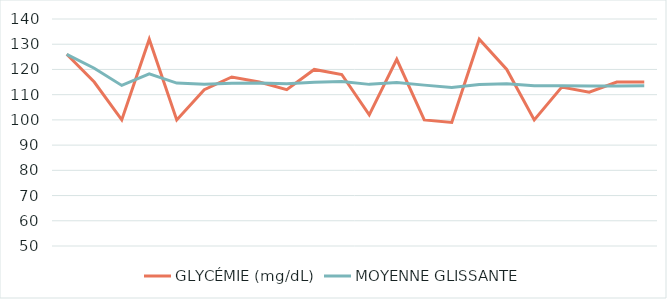
| Category | GLYCÉMIE (mg/dL) | MOYENNE GLISSANTE |
|---|---|---|
| 0 | 126 | 126 |
| 1 | 115 | 120.5 |
| 2 | 100 | 113.667 |
| 3 | 132 | 118.25 |
| 4 | 100 | 114.6 |
| 5 | 112 | 114.167 |
| 6 | 117 | 114.571 |
| 7 | 115 | 114.625 |
| 8 | 112 | 114.333 |
| 9 | 120 | 114.9 |
| 10 | 118 | 115.182 |
| 11 | 102 | 114.083 |
| 12 | 124 | 114.846 |
| 13 | 100 | 113.786 |
| 14 | 99 | 112.8 |
| 15 | 132 | 114 |
| 16 | 120 | 114.353 |
| 17 | 100 | 113.556 |
| 18 | 113 | 113.526 |
| 19 | 111 | 113.4 |
| 20 | 115 | 113.476 |
| 21 | 115 | 113.545 |